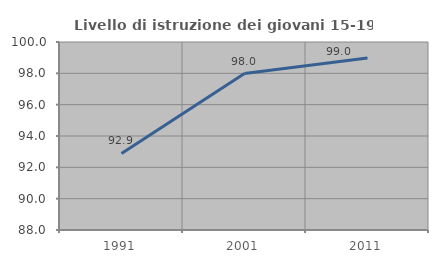
| Category | Livello di istruzione dei giovani 15-19 anni |
|---|---|
| 1991.0 | 92.887 |
| 2001.0 | 97.982 |
| 2011.0 | 98.973 |